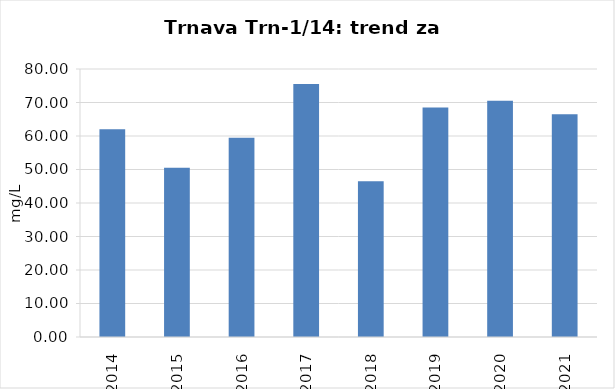
| Category | Vsota |
|---|---|
| 2014 | 62 |
| 2015 | 50.5 |
| 2016 | 59.5 |
| 2017 | 75.5 |
| 2018 | 46.5 |
| 2019 | 68.5 |
| 2020 | 70.5 |
| 2021 | 66.5 |